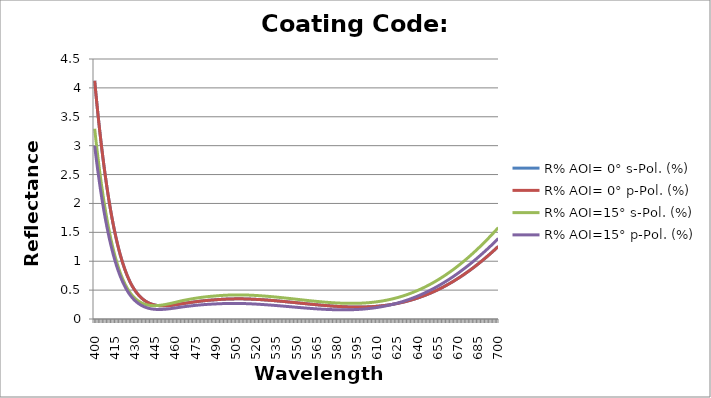
| Category | R% AOI= 0° s-Pol. (%) | R% AOI= 0° p-Pol. (%) | R% AOI=15° s-Pol. (%) | R% AOI=15° p-Pol. (%) |
|---|---|---|---|---|
| 400.0 | 4.124 | 4.124 | 3.293 | 2.997 |
| 401.0 | 3.877 | 3.877 | 3.08 | 2.806 |
| 402.0 | 3.643 | 3.643 | 2.877 | 2.625 |
| 403.0 | 3.419 | 3.419 | 2.686 | 2.454 |
| 404.0 | 3.207 | 3.207 | 2.505 | 2.291 |
| 405.0 | 3.005 | 3.005 | 2.334 | 2.137 |
| 406.0 | 2.814 | 2.814 | 2.172 | 1.992 |
| 407.0 | 2.632 | 2.632 | 2.02 | 1.855 |
| 408.0 | 2.46 | 2.46 | 1.877 | 1.726 |
| 409.0 | 2.297 | 2.297 | 1.743 | 1.605 |
| 410.0 | 2.144 | 2.144 | 1.617 | 1.49 |
| 411.0 | 1.999 | 1.999 | 1.498 | 1.383 |
| 412.0 | 1.862 | 1.862 | 1.388 | 1.282 |
| 413.0 | 1.734 | 1.734 | 1.285 | 1.188 |
| 414.0 | 1.613 | 1.613 | 1.188 | 1.1 |
| 415.0 | 1.499 | 1.499 | 1.099 | 1.018 |
| 416.0 | 1.393 | 1.393 | 1.015 | 0.941 |
| 417.0 | 1.293 | 1.293 | 0.938 | 0.87 |
| 418.0 | 1.2 | 1.2 | 0.866 | 0.803 |
| 419.0 | 1.113 | 1.113 | 0.8 | 0.742 |
| 420.0 | 1.032 | 1.032 | 0.739 | 0.685 |
| 421.0 | 0.957 | 0.957 | 0.683 | 0.632 |
| 422.0 | 0.887 | 0.887 | 0.632 | 0.583 |
| 423.0 | 0.822 | 0.822 | 0.584 | 0.538 |
| 424.0 | 0.762 | 0.762 | 0.541 | 0.497 |
| 425.0 | 0.707 | 0.707 | 0.502 | 0.459 |
| 426.0 | 0.656 | 0.656 | 0.467 | 0.425 |
| 427.0 | 0.609 | 0.609 | 0.435 | 0.394 |
| 428.0 | 0.567 | 0.567 | 0.406 | 0.365 |
| 429.0 | 0.528 | 0.528 | 0.381 | 0.34 |
| 430.0 | 0.493 | 0.493 | 0.358 | 0.317 |
| 431.0 | 0.461 | 0.461 | 0.338 | 0.296 |
| 432.0 | 0.432 | 0.432 | 0.319 | 0.277 |
| 433.0 | 0.405 | 0.405 | 0.303 | 0.26 |
| 434.0 | 0.381 | 0.381 | 0.289 | 0.245 |
| 435.0 | 0.359 | 0.359 | 0.277 | 0.232 |
| 436.0 | 0.34 | 0.34 | 0.267 | 0.22 |
| 437.0 | 0.322 | 0.322 | 0.258 | 0.21 |
| 438.0 | 0.306 | 0.306 | 0.25 | 0.201 |
| 439.0 | 0.292 | 0.292 | 0.244 | 0.193 |
| 440.0 | 0.28 | 0.28 | 0.239 | 0.186 |
| 441.0 | 0.27 | 0.27 | 0.236 | 0.18 |
| 442.0 | 0.26 | 0.26 | 0.233 | 0.176 |
| 443.0 | 0.252 | 0.252 | 0.232 | 0.172 |
| 444.0 | 0.246 | 0.246 | 0.231 | 0.169 |
| 445.0 | 0.24 | 0.24 | 0.231 | 0.167 |
| 446.0 | 0.236 | 0.236 | 0.232 | 0.166 |
| 447.0 | 0.233 | 0.233 | 0.233 | 0.165 |
| 448.0 | 0.23 | 0.23 | 0.236 | 0.165 |
| 449.0 | 0.228 | 0.228 | 0.238 | 0.165 |
| 450.0 | 0.227 | 0.227 | 0.241 | 0.166 |
| 451.0 | 0.227 | 0.227 | 0.245 | 0.167 |
| 452.0 | 0.228 | 0.228 | 0.249 | 0.169 |
| 453.0 | 0.228 | 0.228 | 0.253 | 0.171 |
| 454.0 | 0.23 | 0.23 | 0.258 | 0.173 |
| 455.0 | 0.232 | 0.232 | 0.263 | 0.176 |
| 456.0 | 0.234 | 0.234 | 0.268 | 0.178 |
| 457.0 | 0.236 | 0.236 | 0.273 | 0.181 |
| 458.0 | 0.239 | 0.239 | 0.278 | 0.184 |
| 459.0 | 0.242 | 0.242 | 0.284 | 0.188 |
| 460.0 | 0.246 | 0.246 | 0.289 | 0.191 |
| 461.0 | 0.25 | 0.25 | 0.295 | 0.194 |
| 462.0 | 0.253 | 0.253 | 0.3 | 0.198 |
| 463.0 | 0.257 | 0.257 | 0.306 | 0.201 |
| 464.0 | 0.261 | 0.261 | 0.311 | 0.205 |
| 465.0 | 0.265 | 0.265 | 0.317 | 0.208 |
| 466.0 | 0.268 | 0.268 | 0.322 | 0.212 |
| 467.0 | 0.272 | 0.272 | 0.326 | 0.214 |
| 468.0 | 0.275 | 0.275 | 0.331 | 0.217 |
| 469.0 | 0.279 | 0.279 | 0.335 | 0.22 |
| 470.0 | 0.282 | 0.282 | 0.339 | 0.223 |
| 471.0 | 0.286 | 0.286 | 0.344 | 0.226 |
| 472.0 | 0.289 | 0.289 | 0.348 | 0.228 |
| 473.0 | 0.292 | 0.292 | 0.352 | 0.231 |
| 474.0 | 0.295 | 0.295 | 0.356 | 0.234 |
| 475.0 | 0.298 | 0.298 | 0.359 | 0.236 |
| 476.0 | 0.302 | 0.302 | 0.363 | 0.238 |
| 477.0 | 0.304 | 0.304 | 0.366 | 0.241 |
| 478.0 | 0.307 | 0.307 | 0.37 | 0.243 |
| 479.0 | 0.31 | 0.31 | 0.373 | 0.245 |
| 480.0 | 0.313 | 0.313 | 0.376 | 0.247 |
| 481.0 | 0.315 | 0.315 | 0.379 | 0.249 |
| 482.0 | 0.318 | 0.318 | 0.382 | 0.25 |
| 483.0 | 0.32 | 0.32 | 0.384 | 0.252 |
| 484.0 | 0.322 | 0.322 | 0.387 | 0.254 |
| 485.0 | 0.324 | 0.324 | 0.389 | 0.255 |
| 486.0 | 0.326 | 0.326 | 0.392 | 0.256 |
| 487.0 | 0.328 | 0.328 | 0.394 | 0.258 |
| 488.0 | 0.33 | 0.33 | 0.396 | 0.259 |
| 489.0 | 0.331 | 0.331 | 0.397 | 0.26 |
| 490.0 | 0.333 | 0.333 | 0.399 | 0.261 |
| 491.0 | 0.335 | 0.335 | 0.402 | 0.262 |
| 492.0 | 0.337 | 0.337 | 0.403 | 0.263 |
| 493.0 | 0.338 | 0.338 | 0.405 | 0.264 |
| 494.0 | 0.34 | 0.34 | 0.407 | 0.265 |
| 495.0 | 0.341 | 0.341 | 0.408 | 0.266 |
| 496.0 | 0.342 | 0.342 | 0.41 | 0.267 |
| 497.0 | 0.344 | 0.344 | 0.411 | 0.268 |
| 498.0 | 0.344 | 0.344 | 0.412 | 0.268 |
| 499.0 | 0.345 | 0.345 | 0.413 | 0.269 |
| 500.0 | 0.346 | 0.346 | 0.414 | 0.269 |
| 501.0 | 0.347 | 0.347 | 0.415 | 0.269 |
| 502.0 | 0.348 | 0.348 | 0.416 | 0.27 |
| 503.0 | 0.348 | 0.348 | 0.416 | 0.27 |
| 504.0 | 0.348 | 0.348 | 0.416 | 0.27 |
| 505.0 | 0.349 | 0.349 | 0.417 | 0.27 |
| 506.0 | 0.349 | 0.349 | 0.417 | 0.269 |
| 507.0 | 0.349 | 0.349 | 0.417 | 0.269 |
| 508.0 | 0.349 | 0.349 | 0.417 | 0.269 |
| 509.0 | 0.349 | 0.349 | 0.417 | 0.268 |
| 510.0 | 0.349 | 0.349 | 0.417 | 0.268 |
| 511.0 | 0.348 | 0.348 | 0.416 | 0.267 |
| 512.0 | 0.348 | 0.348 | 0.416 | 0.266 |
| 513.0 | 0.347 | 0.347 | 0.415 | 0.266 |
| 514.0 | 0.346 | 0.346 | 0.414 | 0.265 |
| 515.0 | 0.345 | 0.345 | 0.413 | 0.264 |
| 516.0 | 0.344 | 0.344 | 0.412 | 0.262 |
| 517.0 | 0.343 | 0.343 | 0.411 | 0.261 |
| 518.0 | 0.342 | 0.342 | 0.41 | 0.26 |
| 519.0 | 0.341 | 0.341 | 0.408 | 0.259 |
| 520.0 | 0.34 | 0.34 | 0.407 | 0.258 |
| 521.0 | 0.338 | 0.338 | 0.406 | 0.256 |
| 522.0 | 0.337 | 0.337 | 0.404 | 0.255 |
| 523.0 | 0.336 | 0.336 | 0.402 | 0.254 |
| 524.0 | 0.334 | 0.334 | 0.401 | 0.252 |
| 525.0 | 0.333 | 0.333 | 0.399 | 0.25 |
| 526.0 | 0.331 | 0.331 | 0.397 | 0.249 |
| 527.0 | 0.33 | 0.33 | 0.396 | 0.247 |
| 528.0 | 0.328 | 0.328 | 0.394 | 0.246 |
| 529.0 | 0.326 | 0.326 | 0.392 | 0.244 |
| 530.0 | 0.324 | 0.324 | 0.39 | 0.242 |
| 531.0 | 0.322 | 0.322 | 0.388 | 0.24 |
| 532.0 | 0.321 | 0.321 | 0.386 | 0.238 |
| 533.0 | 0.319 | 0.319 | 0.383 | 0.237 |
| 534.0 | 0.317 | 0.317 | 0.381 | 0.235 |
| 535.0 | 0.315 | 0.315 | 0.379 | 0.233 |
| 536.0 | 0.313 | 0.313 | 0.377 | 0.231 |
| 537.0 | 0.311 | 0.311 | 0.374 | 0.229 |
| 538.0 | 0.308 | 0.308 | 0.372 | 0.227 |
| 539.0 | 0.306 | 0.306 | 0.37 | 0.225 |
| 540.0 | 0.304 | 0.304 | 0.367 | 0.223 |
| 541.0 | 0.302 | 0.302 | 0.365 | 0.221 |
| 542.0 | 0.3 | 0.3 | 0.362 | 0.219 |
| 543.0 | 0.297 | 0.297 | 0.36 | 0.217 |
| 544.0 | 0.295 | 0.295 | 0.357 | 0.215 |
| 545.0 | 0.293 | 0.293 | 0.355 | 0.213 |
| 546.0 | 0.29 | 0.29 | 0.352 | 0.211 |
| 547.0 | 0.288 | 0.288 | 0.35 | 0.209 |
| 548.0 | 0.286 | 0.286 | 0.347 | 0.207 |
| 549.0 | 0.284 | 0.284 | 0.344 | 0.205 |
| 550.0 | 0.281 | 0.281 | 0.342 | 0.203 |
| 551.0 | 0.279 | 0.279 | 0.339 | 0.201 |
| 552.0 | 0.276 | 0.276 | 0.337 | 0.199 |
| 553.0 | 0.274 | 0.274 | 0.334 | 0.197 |
| 554.0 | 0.272 | 0.272 | 0.331 | 0.195 |
| 555.0 | 0.269 | 0.269 | 0.329 | 0.193 |
| 556.0 | 0.267 | 0.267 | 0.326 | 0.191 |
| 557.0 | 0.265 | 0.265 | 0.324 | 0.189 |
| 558.0 | 0.262 | 0.262 | 0.321 | 0.188 |
| 559.0 | 0.26 | 0.26 | 0.319 | 0.186 |
| 560.0 | 0.258 | 0.258 | 0.316 | 0.184 |
| 561.0 | 0.255 | 0.255 | 0.314 | 0.182 |
| 562.0 | 0.253 | 0.253 | 0.311 | 0.18 |
| 563.0 | 0.251 | 0.251 | 0.309 | 0.179 |
| 564.0 | 0.248 | 0.248 | 0.307 | 0.177 |
| 565.0 | 0.246 | 0.246 | 0.304 | 0.176 |
| 566.0 | 0.244 | 0.244 | 0.302 | 0.174 |
| 567.0 | 0.242 | 0.242 | 0.3 | 0.173 |
| 568.0 | 0.24 | 0.24 | 0.298 | 0.171 |
| 569.0 | 0.238 | 0.238 | 0.296 | 0.17 |
| 570.0 | 0.236 | 0.236 | 0.294 | 0.169 |
| 571.0 | 0.234 | 0.234 | 0.292 | 0.168 |
| 572.0 | 0.232 | 0.232 | 0.29 | 0.166 |
| 573.0 | 0.23 | 0.23 | 0.288 | 0.165 |
| 574.0 | 0.229 | 0.229 | 0.286 | 0.164 |
| 575.0 | 0.227 | 0.227 | 0.285 | 0.163 |
| 576.0 | 0.225 | 0.225 | 0.283 | 0.162 |
| 577.0 | 0.223 | 0.223 | 0.282 | 0.162 |
| 578.0 | 0.222 | 0.222 | 0.28 | 0.161 |
| 579.0 | 0.22 | 0.22 | 0.279 | 0.16 |
| 580.0 | 0.219 | 0.219 | 0.278 | 0.16 |
| 581.0 | 0.217 | 0.217 | 0.276 | 0.159 |
| 582.0 | 0.216 | 0.216 | 0.275 | 0.159 |
| 583.0 | 0.215 | 0.215 | 0.274 | 0.159 |
| 584.0 | 0.214 | 0.214 | 0.273 | 0.159 |
| 585.0 | 0.212 | 0.212 | 0.273 | 0.159 |
| 586.0 | 0.212 | 0.212 | 0.272 | 0.159 |
| 587.0 | 0.211 | 0.211 | 0.271 | 0.159 |
| 588.0 | 0.21 | 0.21 | 0.271 | 0.159 |
| 589.0 | 0.209 | 0.209 | 0.271 | 0.16 |
| 590.0 | 0.208 | 0.208 | 0.27 | 0.16 |
| 591.0 | 0.208 | 0.208 | 0.27 | 0.161 |
| 592.0 | 0.207 | 0.207 | 0.27 | 0.162 |
| 593.0 | 0.207 | 0.207 | 0.271 | 0.162 |
| 594.0 | 0.207 | 0.207 | 0.271 | 0.164 |
| 595.0 | 0.207 | 0.207 | 0.272 | 0.165 |
| 596.0 | 0.207 | 0.207 | 0.272 | 0.166 |
| 597.0 | 0.207 | 0.207 | 0.273 | 0.167 |
| 598.0 | 0.207 | 0.207 | 0.274 | 0.169 |
| 599.0 | 0.208 | 0.208 | 0.275 | 0.171 |
| 600.0 | 0.208 | 0.208 | 0.276 | 0.173 |
| 601.0 | 0.209 | 0.209 | 0.278 | 0.175 |
| 602.0 | 0.209 | 0.209 | 0.28 | 0.177 |
| 603.0 | 0.21 | 0.21 | 0.281 | 0.179 |
| 604.0 | 0.211 | 0.211 | 0.283 | 0.182 |
| 605.0 | 0.212 | 0.212 | 0.285 | 0.184 |
| 606.0 | 0.214 | 0.214 | 0.288 | 0.187 |
| 607.0 | 0.215 | 0.215 | 0.29 | 0.19 |
| 608.0 | 0.217 | 0.217 | 0.293 | 0.193 |
| 609.0 | 0.219 | 0.219 | 0.296 | 0.197 |
| 610.0 | 0.22 | 0.22 | 0.299 | 0.2 |
| 611.0 | 0.223 | 0.223 | 0.302 | 0.204 |
| 612.0 | 0.225 | 0.225 | 0.306 | 0.208 |
| 613.0 | 0.227 | 0.227 | 0.309 | 0.212 |
| 614.0 | 0.23 | 0.23 | 0.313 | 0.216 |
| 615.0 | 0.233 | 0.233 | 0.317 | 0.22 |
| 616.0 | 0.236 | 0.236 | 0.322 | 0.225 |
| 617.0 | 0.239 | 0.239 | 0.326 | 0.23 |
| 618.0 | 0.242 | 0.242 | 0.331 | 0.235 |
| 619.0 | 0.245 | 0.245 | 0.336 | 0.24 |
| 620.0 | 0.249 | 0.249 | 0.341 | 0.245 |
| 621.0 | 0.253 | 0.253 | 0.346 | 0.251 |
| 622.0 | 0.257 | 0.257 | 0.352 | 0.257 |
| 623.0 | 0.261 | 0.261 | 0.358 | 0.263 |
| 624.0 | 0.265 | 0.265 | 0.364 | 0.269 |
| 625.0 | 0.27 | 0.27 | 0.37 | 0.275 |
| 626.0 | 0.275 | 0.275 | 0.377 | 0.282 |
| 627.0 | 0.28 | 0.28 | 0.384 | 0.288 |
| 628.0 | 0.285 | 0.285 | 0.391 | 0.296 |
| 629.0 | 0.29 | 0.29 | 0.398 | 0.303 |
| 630.0 | 0.296 | 0.296 | 0.405 | 0.31 |
| 631.0 | 0.302 | 0.302 | 0.413 | 0.318 |
| 632.0 | 0.308 | 0.308 | 0.421 | 0.326 |
| 633.0 | 0.314 | 0.314 | 0.429 | 0.334 |
| 634.0 | 0.32 | 0.32 | 0.438 | 0.342 |
| 635.0 | 0.327 | 0.327 | 0.447 | 0.35 |
| 636.0 | 0.334 | 0.334 | 0.456 | 0.359 |
| 637.0 | 0.341 | 0.341 | 0.465 | 0.368 |
| 638.0 | 0.348 | 0.348 | 0.474 | 0.377 |
| 639.0 | 0.356 | 0.356 | 0.484 | 0.387 |
| 640.0 | 0.363 | 0.363 | 0.494 | 0.396 |
| 641.0 | 0.371 | 0.371 | 0.504 | 0.406 |
| 642.0 | 0.379 | 0.379 | 0.515 | 0.416 |
| 643.0 | 0.388 | 0.388 | 0.526 | 0.427 |
| 644.0 | 0.396 | 0.396 | 0.537 | 0.437 |
| 645.0 | 0.405 | 0.405 | 0.548 | 0.448 |
| 646.0 | 0.414 | 0.414 | 0.56 | 0.459 |
| 647.0 | 0.423 | 0.423 | 0.571 | 0.47 |
| 648.0 | 0.433 | 0.433 | 0.583 | 0.481 |
| 649.0 | 0.442 | 0.442 | 0.596 | 0.493 |
| 650.0 | 0.452 | 0.452 | 0.608 | 0.505 |
| 651.0 | 0.463 | 0.463 | 0.621 | 0.517 |
| 652.0 | 0.473 | 0.473 | 0.634 | 0.529 |
| 653.0 | 0.484 | 0.484 | 0.648 | 0.542 |
| 654.0 | 0.495 | 0.495 | 0.662 | 0.555 |
| 655.0 | 0.506 | 0.506 | 0.676 | 0.568 |
| 656.0 | 0.517 | 0.517 | 0.69 | 0.581 |
| 657.0 | 0.529 | 0.529 | 0.704 | 0.595 |
| 658.0 | 0.541 | 0.541 | 0.719 | 0.608 |
| 659.0 | 0.553 | 0.553 | 0.734 | 0.622 |
| 660.0 | 0.565 | 0.565 | 0.75 | 0.637 |
| 661.0 | 0.578 | 0.578 | 0.765 | 0.651 |
| 662.0 | 0.59 | 0.59 | 0.781 | 0.666 |
| 663.0 | 0.604 | 0.604 | 0.797 | 0.681 |
| 664.0 | 0.617 | 0.617 | 0.814 | 0.696 |
| 665.0 | 0.63 | 0.63 | 0.83 | 0.711 |
| 666.0 | 0.644 | 0.644 | 0.847 | 0.727 |
| 667.0 | 0.658 | 0.658 | 0.865 | 0.743 |
| 668.0 | 0.673 | 0.673 | 0.882 | 0.759 |
| 669.0 | 0.687 | 0.687 | 0.9 | 0.775 |
| 670.0 | 0.702 | 0.702 | 0.918 | 0.792 |
| 671.0 | 0.717 | 0.717 | 0.936 | 0.809 |
| 672.0 | 0.732 | 0.732 | 0.955 | 0.826 |
| 673.0 | 0.748 | 0.748 | 0.974 | 0.843 |
| 674.0 | 0.764 | 0.764 | 0.993 | 0.861 |
| 675.0 | 0.78 | 0.78 | 1.012 | 0.878 |
| 676.0 | 0.796 | 0.796 | 1.032 | 0.896 |
| 677.0 | 0.812 | 0.812 | 1.052 | 0.914 |
| 678.0 | 0.829 | 0.829 | 1.072 | 0.933 |
| 679.0 | 0.846 | 0.846 | 1.093 | 0.952 |
| 680.0 | 0.863 | 0.863 | 1.114 | 0.97 |
| 681.0 | 0.881 | 0.881 | 1.135 | 0.99 |
| 682.0 | 0.898 | 0.898 | 1.156 | 1.009 |
| 683.0 | 0.916 | 0.916 | 1.177 | 1.028 |
| 684.0 | 0.934 | 0.934 | 1.199 | 1.048 |
| 685.0 | 0.953 | 0.953 | 1.221 | 1.068 |
| 686.0 | 0.972 | 0.972 | 1.244 | 1.088 |
| 687.0 | 0.99 | 0.99 | 1.266 | 1.109 |
| 688.0 | 1.01 | 1.01 | 1.289 | 1.129 |
| 689.0 | 1.029 | 1.029 | 1.312 | 1.15 |
| 690.0 | 1.048 | 1.048 | 1.335 | 1.171 |
| 691.0 | 1.068 | 1.068 | 1.359 | 1.192 |
| 692.0 | 1.088 | 1.088 | 1.383 | 1.214 |
| 693.0 | 1.109 | 1.109 | 1.407 | 1.236 |
| 694.0 | 1.129 | 1.129 | 1.431 | 1.257 |
| 695.0 | 1.15 | 1.15 | 1.456 | 1.28 |
| 696.0 | 1.171 | 1.171 | 1.48 | 1.302 |
| 697.0 | 1.192 | 1.192 | 1.505 | 1.324 |
| 698.0 | 1.214 | 1.214 | 1.531 | 1.347 |
| 699.0 | 1.235 | 1.235 | 1.556 | 1.37 |
| 700.0 | 1.257 | 1.257 | 1.582 | 1.393 |